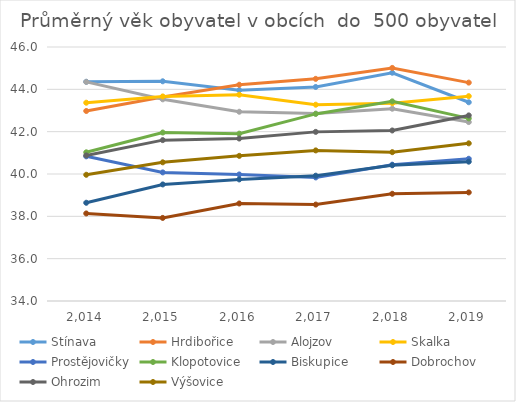
| Category | Stínava | Hrdibořice | Alojzov | Skalka | Prostějovičky | Klopotovice | Biskupice | Dobrochov | Ohrozim | Výšovice |
|---|---|---|---|---|---|---|---|---|---|---|
| 2014.0 | 44.357 | 42.977 | 44.351 | 43.367 | 40.835 | 41.025 | 38.641 | 38.136 | 40.878 | 39.964 |
| 2015.0 | 44.38 | 43.636 | 43.528 | 43.664 | 40.075 | 41.959 | 39.506 | 37.926 | 41.6 | 40.551 |
| 2016.0 | 43.962 | 44.216 | 42.941 | 43.746 | 39.978 | 41.906 | 39.744 | 38.606 | 41.676 | 40.857 |
| 2017.0 | 44.111 | 44.495 | 42.855 | 43.274 | 39.838 | 42.84 | 39.921 | 38.556 | 41.99 | 41.114 |
| 2018.0 | 44.784 | 45.012 | 43.084 | 43.346 | 40.441 | 43.432 | 40.412 | 39.066 | 42.056 | 41.031 |
| 2019.0 | 43.389 | 44.318 | 42.454 | 43.678 | 40.719 | 42.628 | 40.583 | 39.13 | 42.768 | 41.449 |